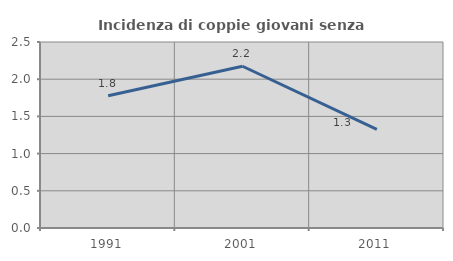
| Category | Incidenza di coppie giovani senza figli |
|---|---|
| 1991.0 | 1.778 |
| 2001.0 | 2.174 |
| 2011.0 | 1.325 |